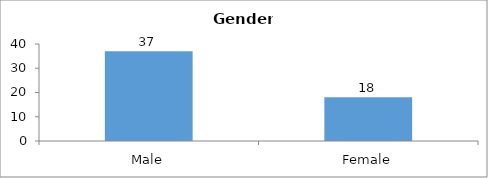
| Category | Gender |
|---|---|
| Male | 37 |
| Female | 18 |